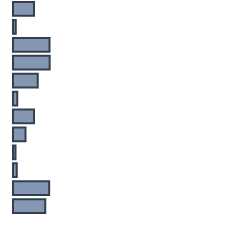
| Category | Series 0 |
|---|---|
| 0 | 8.974 |
| 1 | 1.146 |
| 2 | 15.597 |
| 3 | 15.663 |
| 4 | 10.58 |
| 5 | 1.818 |
| 6 | 8.992 |
| 7 | 5.311 |
| 8 | 1.105 |
| 9 | 1.566 |
| 10 | 15.456 |
| 11 | 13.793 |